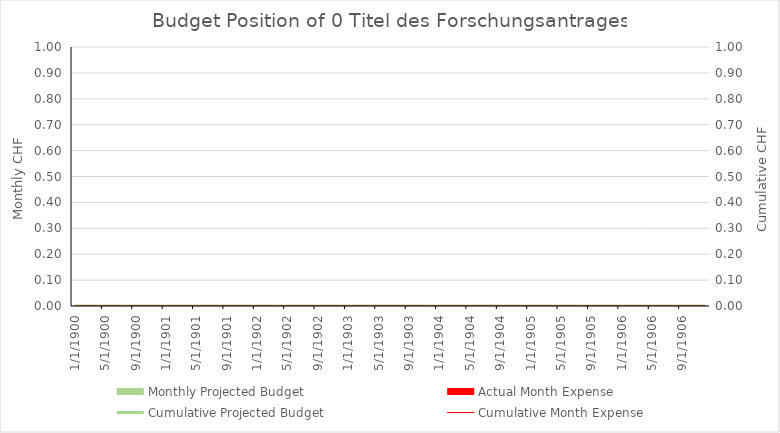
| Category | Monthly Projected Budget | Actual Month Expense |
|---|---|---|
| 1/31/00 | 0 | 0 |
| 2/28/00 | 0 | 0 |
| 3/31/00 | 0 | 0 |
| 4/30/00 | 0 | 0 |
| 5/31/00 | 0 | 0 |
| 6/30/00 | 0 | 0 |
| 7/31/00 | 0 | 0 |
| 8/31/00 | 0 | 0 |
| 9/30/00 | 0 | 0 |
| 10/31/00 | 0 | 0 |
| 11/30/00 | 0 | 0 |
| 12/31/00 | 0 | 0 |
| 1/31/01 | 0 | 0 |
| 2/28/01 | 0 | 0 |
| 3/31/01 | 0 | 0 |
| 4/30/01 | 0 | 0 |
| 5/31/01 | 0 | 0 |
| 6/30/01 | 0 | 0 |
| 7/31/01 | 0 | 0 |
| 8/31/01 | 0 | 0 |
| 9/30/01 | 0 | 0 |
| 10/31/01 | 0 | 0 |
| 11/30/01 | 0 | 0 |
| 12/31/01 | 0 | 0 |
| 1/31/02 | 0 | 0 |
| 2/28/02 | 0 | 0 |
| 3/31/02 | 0 | 0 |
| 4/30/02 | 0 | 0 |
| 5/31/02 | 0 | 0 |
| 6/30/02 | 0 | 0 |
| 7/31/02 | 0 | 0 |
| 8/31/02 | 0 | 0 |
| 9/30/02 | 0 | 0 |
| 10/31/02 | 0 | 0 |
| 11/30/02 | 0 | 0 |
| 12/31/02 | 0 | 0 |
| 1/31/03 | 0 | 0 |
| 2/28/03 | 0 | 0 |
| 3/31/03 | 0 | 0 |
| 4/30/03 | 0 | 0 |
| 5/31/03 | 0 | 0 |
| 6/30/03 | 0 | 0 |
| 7/31/03 | 0 | 0 |
| 8/31/03 | 0 | 0 |
| 9/30/03 | 0 | 0 |
| 10/31/03 | 0 | 0 |
| 11/30/03 | 0 | 0 |
| 12/31/03 | 0 | 0 |
| 1/31/04 | 0 | 0 |
| 2/29/04 | 0 | 0 |
| 3/31/04 | 0 | 0 |
| 4/30/04 | 0 | 0 |
| 5/31/04 | 0 | 0 |
| 6/30/04 | 0 | 0 |
| 7/31/04 | 0 | 0 |
| 8/31/04 | 0 | 0 |
| 9/30/04 | 0 | 0 |
| 10/31/04 | 0 | 0 |
| 11/30/04 | 0 | 0 |
| 12/31/04 | 0 | 0 |
| 1/31/05 | 0 | 0 |
| 2/28/05 | 0 | 0 |
| 3/31/05 | 0 | 0 |
| 4/30/05 | 0 | 0 |
| 5/31/05 | 0 | 0 |
| 6/30/05 | 0 | 0 |
| 7/31/05 | 0 | 0 |
| 8/31/05 | 0 | 0 |
| 9/30/05 | 0 | 0 |
| 10/31/05 | 0 | 0 |
| 11/30/05 | 0 | 0 |
| 12/31/05 | 0 | 0 |
| 1/31/06 | 0 | 0 |
| 2/28/06 | 0 | 0 |
| 3/31/06 | 0 | 0 |
| 4/30/06 | 0 | 0 |
| 5/31/06 | 0 | 0 |
| 6/30/06 | 0 | 0 |
| 7/31/06 | 0 | 0 |
| 8/31/06 | 0 | 0 |
| 9/30/06 | 0 | 0 |
| 10/31/06 | 0 | 0 |
| 11/30/06 | 0 | 0 |
| 12/31/06 | 0 | 0 |